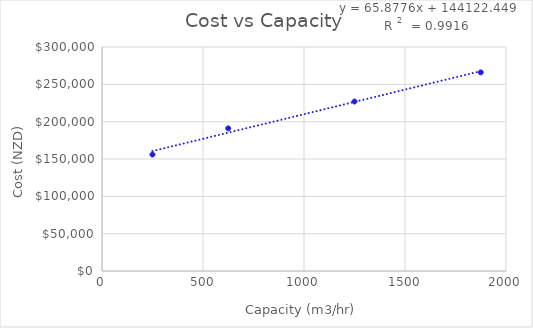
| Category | Series 0 |
|---|---|
| 250.0 | 156000 |
| 625.0 | 191000 |
| 1250.0 | 227000 |
| 1875.0 | 266000 |